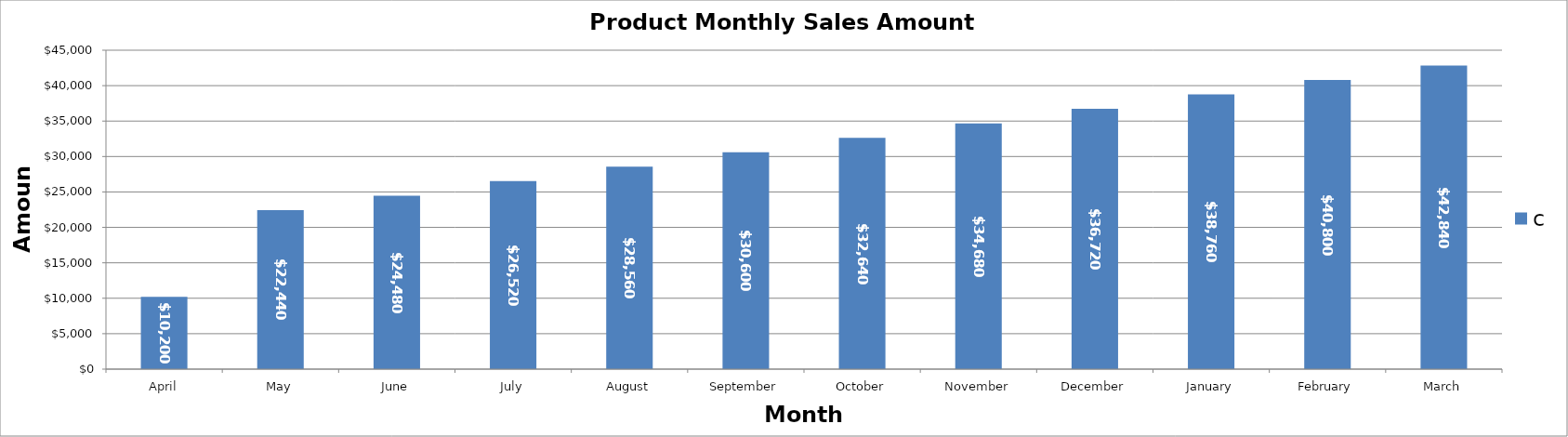
| Category | c |
|---|---|
| April | 10200 |
| May | 22440 |
| June | 24480 |
| July | 26520 |
| August | 28560 |
| September | 30600 |
| October | 32640 |
| November | 34680 |
| December | 36720 |
| January | 38760 |
| February | 40800 |
| March | 42840 |